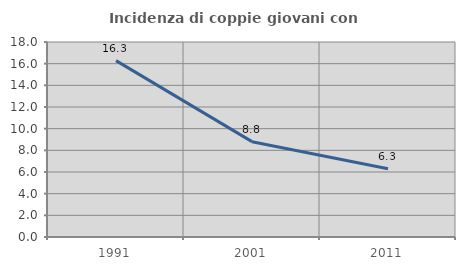
| Category | Incidenza di coppie giovani con figli |
|---|---|
| 1991.0 | 16.282 |
| 2001.0 | 8.801 |
| 2011.0 | 6.3 |